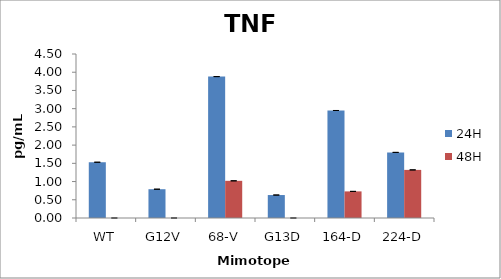
| Category | 24H | 48H |
|---|---|---|
| WT | 1.53 | 0 |
| G12V | 0.79 | 0 |
| 68-V | 3.88 | 1.02 |
| G13D | 0.63 | 0 |
| 164-D | 2.95 | 0.73 |
| 224-D | 1.8 | 1.32 |